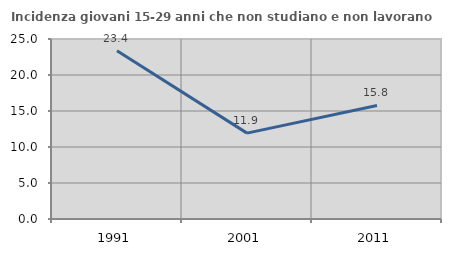
| Category | Incidenza giovani 15-29 anni che non studiano e non lavorano  |
|---|---|
| 1991.0 | 23.374 |
| 2001.0 | 11.929 |
| 2011.0 | 15.766 |